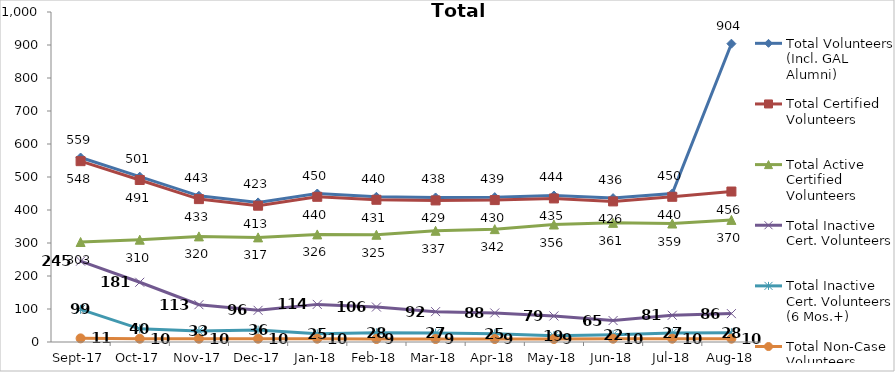
| Category | Total Volunteers (Incl. GAL Alumni) | Total Certified Volunteers | Total Active Certified Volunteers | Total Inactive Cert. Volunteers | Total Inactive Cert. Volunteers (6 Mos.+) | Total Non-Case Volunteers |
|---|---|---|---|---|---|---|
| 2017-09-01 | 559 | 548 | 303 | 245 | 99 | 11 |
| 2017-10-01 | 501 | 491 | 310 | 181 | 40 | 10 |
| 2017-11-01 | 443 | 433 | 320 | 113 | 33 | 10 |
| 2017-12-01 | 423 | 413 | 317 | 96 | 36 | 10 |
| 2018-01-01 | 450 | 440 | 326 | 114 | 25 | 10 |
| 2018-02-01 | 440 | 431 | 325 | 106 | 28 | 9 |
| 2018-03-01 | 438 | 429 | 337 | 92 | 27 | 9 |
| 2018-04-01 | 439 | 430 | 342 | 88 | 25 | 9 |
| 2018-05-01 | 444 | 435 | 356 | 79 | 19 | 9 |
| 2018-06-01 | 436 | 426 | 361 | 65 | 22 | 10 |
| 2018-07-01 | 450 | 440 | 359 | 81 | 27 | 10 |
| 2018-08-01 | 904 | 456 | 370 | 86 | 28 | 10 |